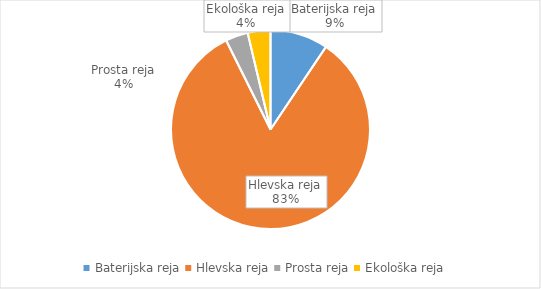
| Category | Količina kosov jajc |
|---|---|
| Baterijska reja | 264681 |
| Hlevska reja | 2340907 |
| Prosta reja | 103006 |
| Ekološka reja | 103945 |